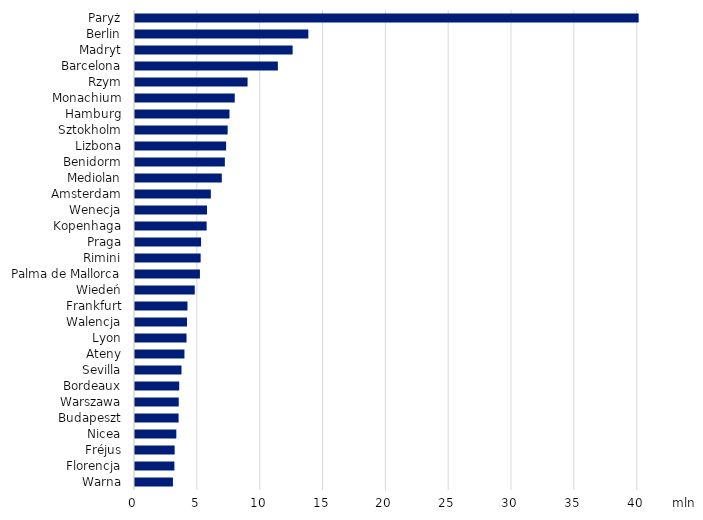
| Category | Series 0 |
|---|---|
| Paryż | 40.075 |
| Berlin | 13.793 |
| Madryt | 12.542 |
| Barcelona | 11.368 |
| Rzym | 8.958 |
| Monachium | 7.937 |
| Hamburg | 7.517 |
| Sztokholm | 7.371 |
| Lizbona | 7.25 |
| Benidorm | 7.15 |
| Mediolan | 6.906 |
| Amsterdam | 6.035 |
| Wenecja | 5.728 |
| Kopenhaga | 5.7 |
| Praga | 5.257 |
| Rimini | 5.222 |
| Palma de Mallorca | 5.165 |
| Wiedeń | 4.754 |
| Frankfurt | 4.174 |
| Walencja | 4.136 |
| Lyon | 4.101 |
| Ateny | 3.934 |
| Sevilla | 3.699 |
| Bordeaux | 3.518 |
| Warszawa | 3.48 |
| Budapeszt | 3.468 |
| Nicea | 3.288 |
| Fréjus | 3.154 |
| Florencja | 3.135 |
| Warna | 3.018 |